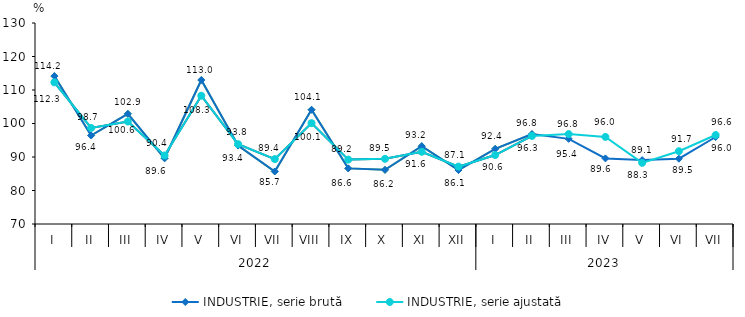
| Category | INDUSTRIE, serie brută | INDUSTRIE, serie ajustată |
|---|---|---|
| 0 | 114.151 | 112.283 |
| 1 | 96.419 | 98.68 |
| 2 | 102.886 | 100.594 |
| 3 | 89.614 | 90.447 |
| 4 | 112.973 | 108.294 |
| 5 | 93.417 | 93.82 |
| 6 | 85.678 | 89.372 |
| 7 | 104.099 | 100.102 |
| 8 | 86.603 | 89.228 |
| 9 | 86.164 | 89.466 |
| 10 | 93.241 | 91.558 |
| 11 | 86.103 | 87.134 |
| 12 | 92.442 | 90.58 |
| 13 | 96.83 | 96.297 |
| 14 | 95.412 | 96.841 |
| 15 | 89.583 | 95.998 |
| 16 | 89.076 | 88.254 |
| 17 | 89.492 | 91.722 |
| 18 | 95.972 | 96.566 |